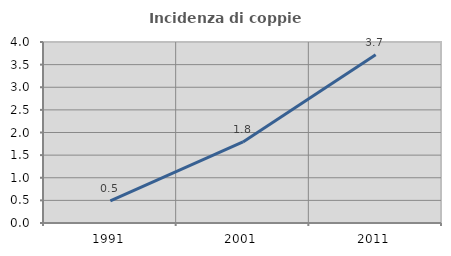
| Category | Incidenza di coppie miste |
|---|---|
| 1991.0 | 0.49 |
| 2001.0 | 1.793 |
| 2011.0 | 3.719 |